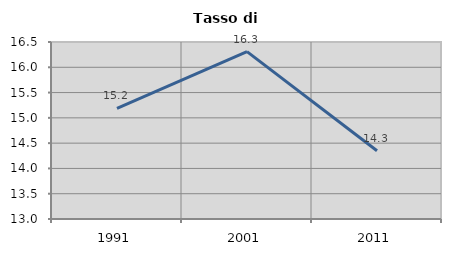
| Category | Tasso di disoccupazione   |
|---|---|
| 1991.0 | 15.19 |
| 2001.0 | 16.309 |
| 2011.0 | 14.35 |